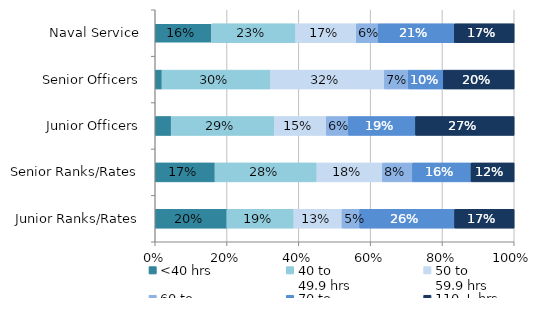
| Category | <40 hrs | 40 to 
49.9 hrs | 50 to 
59.9 hrs | 60 to 
69.9 hrs | 70 to 
109.9 hrs | 110 + hrs |
|---|---|---|---|---|---|---|
| Naval Service | 0.157 | 0.234 | 0.169 | 0.061 | 0.212 | 0.167 |
| Senior Officers | 0.019 | 0.302 | 0.317 | 0.066 | 0.098 | 0.197 |
| Junior Officers | 0.044 | 0.287 | 0.145 | 0.061 | 0.187 | 0.275 |
| Senior Ranks/Rates | 0.166 | 0.284 | 0.183 | 0.083 | 0.163 | 0.12 |
| Junior Ranks/Rates | 0.2 | 0.186 | 0.134 | 0.049 | 0.265 | 0.166 |